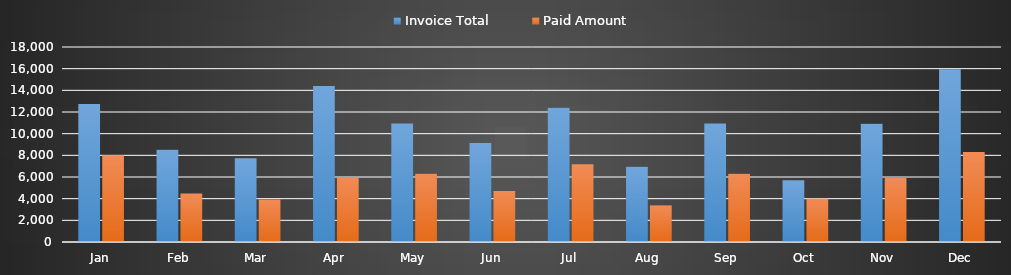
| Category | Invoice Total | Paid Amount |
|---|---|---|
| Jan | 12740 | 8005 |
| Feb | 8510 | 4480 |
| Mar | 7735 | 3930 |
| Apr | 14390 | 5955 |
| May | 10940 | 6305 |
| Jun | 9140 | 4705 |
| Jul | 12390 | 7175 |
| Aug | 6935 | 3380 |
| Sep | 10940 | 6305 |
| Oct | 5705 | 4000 |
| Nov | 10905 | 5915 |
| Dec | 15940 | 8305 |